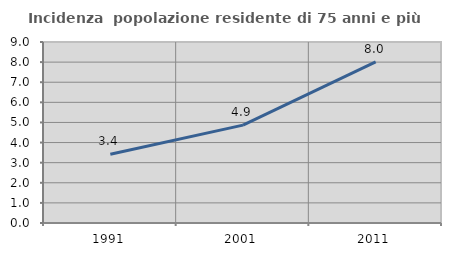
| Category | Incidenza  popolazione residente di 75 anni e più |
|---|---|
| 1991.0 | 3.422 |
| 2001.0 | 4.867 |
| 2011.0 | 8.008 |